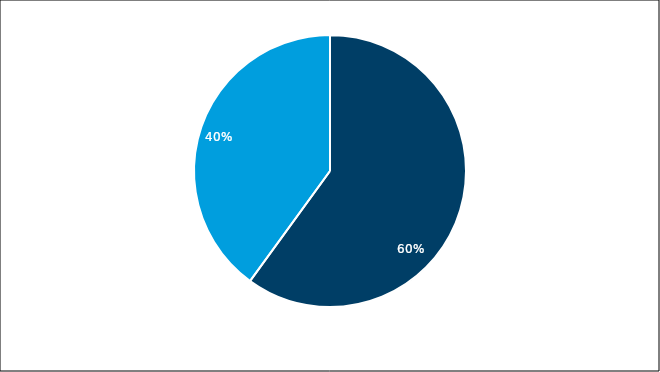
| Category | Votes for "What Focus Area stood out as most important?" |
|---|---|
| Community Power/ Engagement | 6 |
| Resources | 4 |